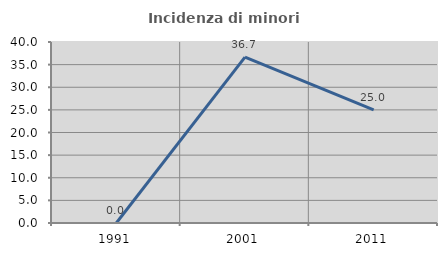
| Category | Incidenza di minori stranieri |
|---|---|
| 1991.0 | 0 |
| 2001.0 | 36.667 |
| 2011.0 | 25 |